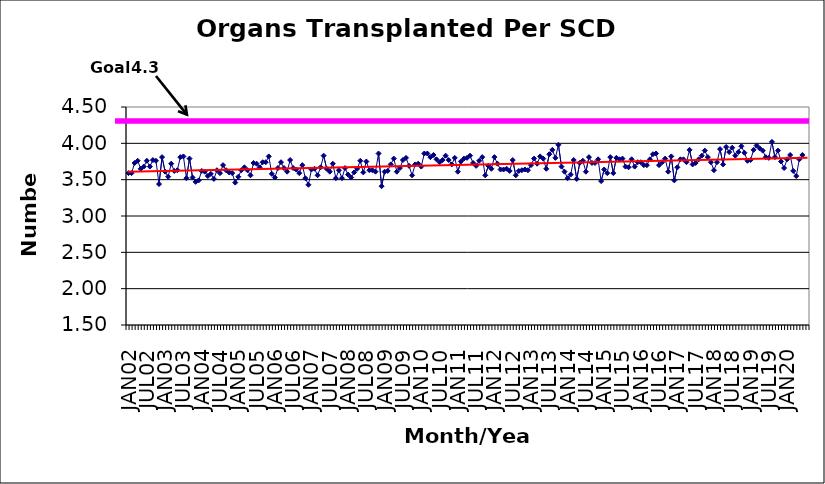
| Category | Series 0 |
|---|---|
| JAN02 | 3.59 |
| FEB02 | 3.59 |
| MAR02 | 3.73 |
| APR02 | 3.76 |
| MAY02 | 3.65 |
| JUN02 | 3.68 |
| JUL02 | 3.76 |
| AUG02 | 3.68 |
| SEP02 | 3.77 |
| OCT02 | 3.76 |
| NOV02 | 3.44 |
| DEC02 | 3.81 |
| JAN03 | 3.61 |
| FEB03 | 3.54 |
| MAR03 | 3.72 |
| APR03 | 3.62 |
| MAY03 | 3.63 |
| JUN03 | 3.81 |
| JUL03 | 3.82 |
| AUG03 | 3.52 |
| SEP03 | 3.79 |
| OCT03 | 3.53 |
| NOV03 | 3.47 |
| DEC03 | 3.49 |
| JAN04 | 3.62 |
| FEB04 | 3.61 |
| MAR04 | 3.55 |
| APR04 | 3.58 |
| MAY04 | 3.51 |
| JUN04 | 3.63 |
| JUL04 | 3.59 |
| AUG04 | 3.7 |
| SEP04 | 3.63 |
| OCT04 | 3.6 |
| NOV04 | 3.59 |
| DEC04 | 3.46 |
| JAN05 | 3.54 |
| FEB05 | 3.63 |
| MAR05 | 3.67 |
| APR05 | 3.63 |
| MAY05 | 3.56 |
| JUN05 | 3.73 |
| JUL05 | 3.72 |
| AUG05 | 3.67 |
| SEP05 | 3.74 |
| OCT05 | 3.74 |
| NOV05 | 3.82 |
| DEC05 | 3.58 |
| JAN06 | 3.53 |
| FEB06 | 3.66 |
| MAR06 | 3.74 |
| APR06 | 3.66 |
| MAY06 | 3.61 |
| JUN06 | 3.77 |
| JUL06 | 3.66 |
| AUG06 | 3.64 |
| SEP06 | 3.59 |
| OCT06 | 3.7 |
| NOV06 | 3.52 |
| DEC06 | 3.43 |
| JAN07 | 3.64 |
| FEB07 | 3.65 |
| MAR07 | 3.56 |
| APR07 | 3.67 |
| MAY07 | 3.83 |
| JUN07 | 3.65 |
| JUL07 | 3.61 |
| AUG07 | 3.72 |
| SEP07 | 3.52 |
| OCT07 | 3.63 |
| NOV07 | 3.52 |
| DEC07 | 3.66 |
| JAN08 | 3.57 |
| FEB08 | 3.53 |
| MAR08 | 3.6 |
| APR08 | 3.65 |
| MAY08 | 3.76 |
| JUN08 | 3.6 |
| JUL08 | 3.75 |
| AUG08 | 3.63 |
| SEP08 | 3.63 |
| OCT08 | 3.61 |
| NOV08 | 3.86 |
| DEC08 | 3.41 |
| JAN09 | 3.61 |
| FEB09 | 3.62 |
| MAR09 | 3.71 |
| APR09 | 3.79 |
| MAY09 | 3.61 |
| JUN09 | 3.66 |
| JUL09 | 3.77 |
| AUG09 | 3.8 |
| SEP09 | 3.69 |
| OCT09 | 3.56 |
| NOV09 | 3.71 |
| DEC09 | 3.72 |
| JAN10 | 3.68 |
| FEB10 | 3.86 |
| MAR10 | 3.86 |
| APR10 | 3.81 |
| MAY10 | 3.84 |
| JUN10 | 3.78 |
| JUL10 | 3.74 |
| AUG10 | 3.77 |
| SEP10 | 3.83 |
| OCT10 | 3.77 |
| NOV10 | 3.71 |
| DEC10 | 3.8 |
| JAN11 | 3.61 |
| FEB11 | 3.75 |
| MAR11 | 3.79 |
| APR11 | 3.8 |
| MAY11 | 3.83 |
| JUN11 | 3.73 |
| JUL11 | 3.69 |
| AUG11 | 3.76 |
| SEP11 | 3.81 |
| OCT11 | 3.56 |
| NOV11 | 3.69 |
| DEC11 | 3.65 |
| JAN12 | 3.81 |
| FEB12 | 3.72 |
| MAR12 | 3.64 |
| APR12 | 3.64 |
| MAY12 | 3.65 |
| JUN12 | 3.62 |
| JUL12 | 3.77 |
| AUG12 | 3.56 |
| SEP12 | 3.62 |
| OCT12 | 3.63 |
| NOV12 | 3.64 |
| DEC12 | 3.63 |
| JAN13 | 3.7 |
| FEB13 | 3.79 |
| MAR13 | 3.72 |
| APR13 | 3.82 |
| MAY13 | 3.79 |
| JUN13 | 3.65 |
| JUL13 | 3.85 |
| AUG13 | 3.91 |
| SEP13 | 3.8 |
| OCT13 | 3.98 |
| NOV13 | 3.68 |
| DEC13 | 3.61 |
| JAN14 | 3.52 |
| FEB14 | 3.57 |
| MAR14 | 3.77 |
| APR14 | 3.51 |
| MAY14 | 3.73 |
| JUN14 | 3.76 |
| JUL14 | 3.61 |
| AUG14 | 3.81 |
| SEP14 | 3.73 |
| OCT14 | 3.73 |
| NOV14 | 3.78 |
| DEC14 | 3.48 |
| JAN15 | 3.64 |
| FEB15 | 3.59 |
| MAR15 | 3.81 |
| APR15 | 3.59 |
| MAY15 | 3.8 |
| JUN15 | 3.78 |
| JUL15 | 3.79 |
| AUG15 | 3.68 |
| SEP15 | 3.67 |
| OCT15 | 3.78 |
| NOV15 | 3.68 |
| DEC15 | 3.74 |
| JAN16 | 3.74 |
| FEB16 | 3.7 |
| MAR16 | 3.7 |
| APR16 | 3.78 |
| MAY16 | 3.85 |
| JUN16 | 3.86 |
| JUL16 | 3.7 |
| AUG16 | 3.74 |
| SEP16 | 3.79 |
| OCT16 | 3.61 |
| NOV16 | 3.82 |
| DEC16 | 3.49 |
| JAN17 | 3.67 |
| FEB17 | 3.78 |
| MAR17 | 3.78 |
| APR17 | 3.74 |
| MAY17 | 3.91 |
| JUN17 | 3.71 |
| JUL17 | 3.73 |
| AUG17 | 3.78 |
| SEP17 | 3.83 |
| OCT17 | 3.9 |
| NOV17 | 3.81 |
| DEC17 | 3.74 |
| JAN18 | 3.63 |
| FEB18 | 3.74 |
| MAR18 | 3.92 |
| APR18 | 3.71 |
| MAY18 | 3.95 |
| JUN18 | 3.88 |
| JUL18 | 3.94 |
| AUG18 | 3.83 |
| SEP18 | 3.88 |
| OCT18 | 3.96 |
| NOV18 | 3.87 |
| DEC18 | 3.76 |
| JAN19 | 3.77 |
| FEB19 | 3.91 |
| MAR19 | 3.97 |
| APR19 | 3.93 |
| MAY19 | 3.9 |
| JUN19 | 3.81 |
| JUL19 | 3.8 |
| AUG19 | 4.02 |
| SEP19 | 3.81 |
| OCT19 | 3.9 |
| NOV19 | 3.75 |
| DEC19 | 3.66 |
| JAN20 | 3.78 |
| FEB20 | 3.84 |
| MAR20 | 3.62 |
| APR20 | 3.55 |
| MAY20 | 3.78 |
| JUN20 | 3.84 |